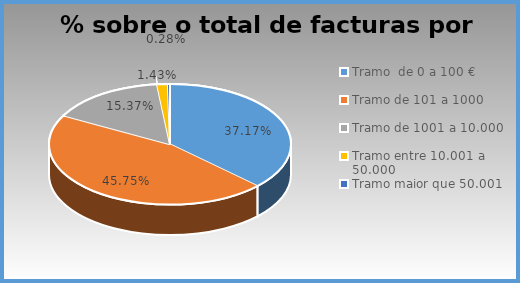
| Category | Series 0 |
|---|---|
| Tramo  de 0 a 100 € | 0.372 |
| Tramo de 101 a 1000 | 0.457 |
| Tramo de 1001 a 10.000 | 0.154 |
| Tramo entre 10.001 a 50.000 | 0.014 |
| Tramo maior que 50.001 | 0.003 |